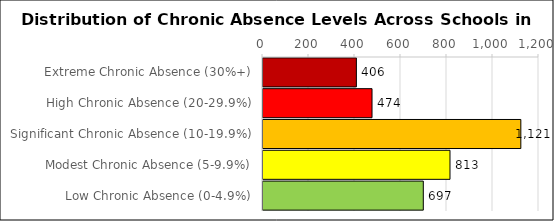
| Category | Number of Schools |
|---|---|
| Extreme Chronic Absence (30%+) | 406 |
| High Chronic Absence (20-29.9%) | 474 |
| Significant Chronic Absence (10-19.9%) | 1121 |
| Modest Chronic Absence (5-9.9%) | 813 |
| Low Chronic Absence (0-4.9%) | 697 |